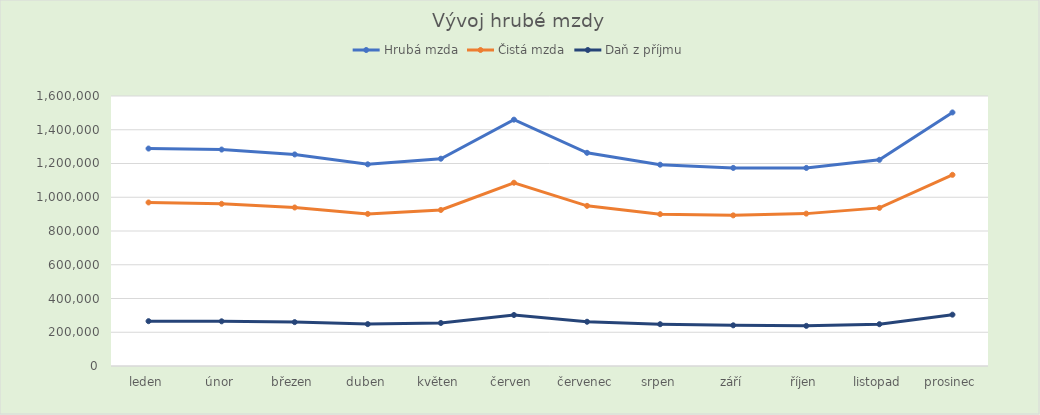
| Category | Hrubá mzda | Čistá mzda | Daň z příjmu |
|---|---|---|---|
| leden | 1288607 | 969178 | 265583 |
| únor | 1282656 | 960982 | 264733 |
| březen | 1253786 | 939326 | 260014 |
| duben | 1195180 | 901343 | 248239 |
| květen | 1228384 | 924570 | 254899 |
| červen | 1459806 | 1086067 | 302212 |
| červenec | 1263371 | 949036 | 262258 |
| srpen | 1192791 | 899732 | 247729 |
| září | 1173830 | 892606 | 241116 |
| říjen | 1173717 | 902978 | 237829 |
| listopad | 1221879 | 937003 | 247657 |
| prosinec | 1502547 | 1132900 | 304259 |